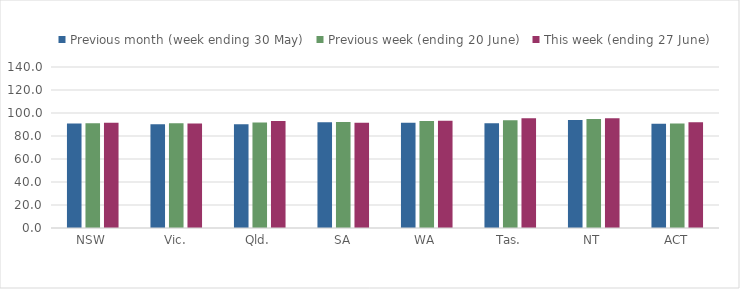
| Category | Previous month (week ending 30 May) | Previous week (ending 20 June) | This week (ending 27 June) |
|---|---|---|---|
| NSW | 90.826 | 91.129 | 91.582 |
| Vic. | 90.303 | 91.16 | 90.86 |
| Qld. | 90.135 | 91.657 | 92.995 |
| SA | 91.856 | 92.277 | 91.496 |
| WA | 91.482 | 92.989 | 93.189 |
| Tas. | 91.112 | 93.693 | 95.45 |
| NT | 93.956 | 94.835 | 95.499 |
| ACT | 90.674 | 90.933 | 92.025 |